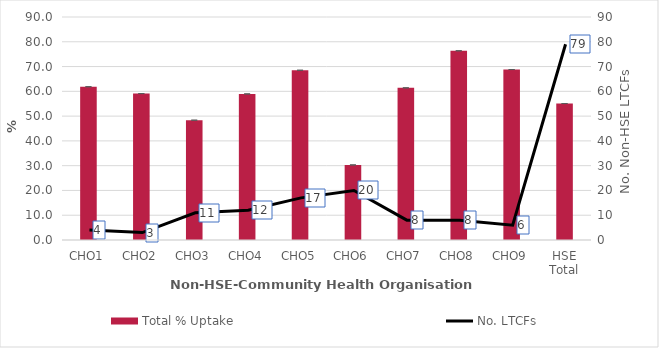
| Category | Total % Uptake |
|---|---|
| 0 | 61.856 |
| 1 | 59.091 |
| 2 | 48.353 |
| 3 | 58.955 |
| 4 | 68.505 |
| 5 | 30.289 |
| 6 | 61.397 |
| 7 | 76.364 |
| 8 | 68.798 |
| 9 | 55.065 |